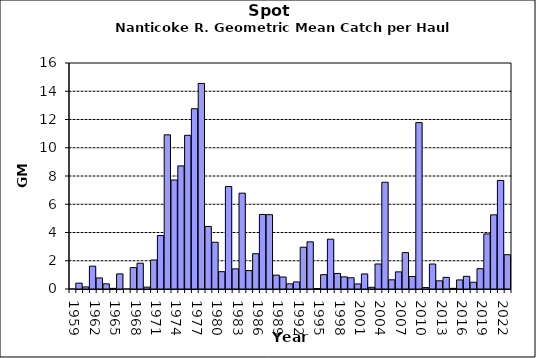
| Category | Series 0 |
|---|---|
| 1959.0 | 0 |
| 1960.0 | 0.414 |
| 1961.0 | 0.147 |
| 1962.0 | 1.616 |
| 1963.0 | 0.782 |
| 1964.0 | 0.364 |
| 1965.0 | 0.044 |
| 1966.0 | 1.07 |
| 1967.0 | 0 |
| 1968.0 | 1.513 |
| 1969.0 | 1.827 |
| 1970.0 | 0.133 |
| 1971.0 | 2.054 |
| 1972.0 | 3.784 |
| 1973.0 | 10.914 |
| 1974.0 | 7.716 |
| 1975.0 | 8.715 |
| 1976.0 | 10.88 |
| 1977.0 | 12.761 |
| 1978.0 | 14.551 |
| 1979.0 | 4.428 |
| 1980.0 | 3.309 |
| 1981.0 | 1.228 |
| 1982.0 | 7.254 |
| 1983.0 | 1.427 |
| 1984.0 | 6.785 |
| 1985.0 | 1.303 |
| 1986.0 | 2.499 |
| 1987.0 | 5.276 |
| 1988.0 | 5.262 |
| 1989.0 | 0.982 |
| 1990.0 | 0.85 |
| 1991.0 | 0.364 |
| 1992.0 | 0.502 |
| 1993.0 | 2.958 |
| 1994.0 | 3.339 |
| 1995.0 | 0.029 |
| 1996.0 | 1.016 |
| 1997.0 | 3.526 |
| 1998.0 | 1.101 |
| 1999.0 | 0.859 |
| 2000.0 | 0.796 |
| 2001.0 | 0.358 |
| 2002.0 | 1.065 |
| 2003.0 | 0.122 |
| 2004.0 | 1.77 |
| 2005.0 | 7.556 |
| 2006.0 | 0.651 |
| 2007.0 | 1.213 |
| 2008.0 | 2.574 |
| 2009.0 | 0.884 |
| 2010.0 | 11.78 |
| 2011.0 | 0.101 |
| 2012.0 | 1.769 |
| 2013.0 | 0.58 |
| 2014.0 | 0.825 |
| 2015.0 | 0.047 |
| 2016.0 | 0.643 |
| 2017.0 | 0.898 |
| 2018.0 | 0.476 |
| 2019.0 | 1.438 |
| 2020.0 | 3.9 |
| 2021.0 | 5.251 |
| 2022.0 | 7.688 |
| 2023.0 | 2.428 |